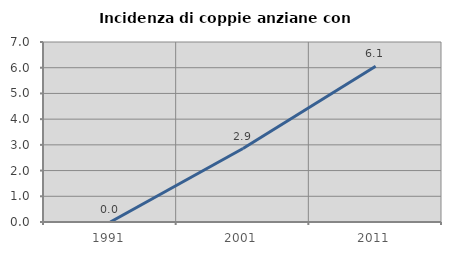
| Category | Incidenza di coppie anziane con figli |
|---|---|
| 1991.0 | 0 |
| 2001.0 | 2.857 |
| 2011.0 | 6.061 |